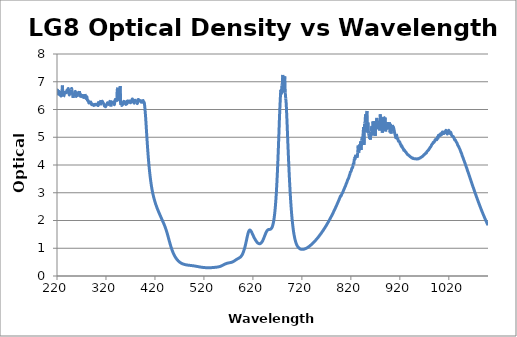
| Category | Optical Density |
|---|---|
| 200.0 | 6.448 |
| 201.0 | 6.433 |
| 202.0 | 6.392 |
| 203.0 | 6.585 |
| 204.0 | 6.576 |
| 205.0 | 6.474 |
| 206.0 | 6.541 |
| 207.0 | 6.442 |
| 208.0 | 6.505 |
| 209.0 | 6.621 |
| 210.0 | 6.461 |
| 211.0 | 6.497 |
| 212.0 | 6.621 |
| 213.0 | 6.536 |
| 214.0 | 6.559 |
| 215.0 | 6.58 |
| 216.0 | 6.502 |
| 217.0 | 6.586 |
| 218.0 | 6.65 |
| 219.0 | 6.626 |
| 220.0 | 6.564 |
| 221.0 | 6.699 |
| 222.0 | 6.606 |
| 223.0 | 6.649 |
| 224.0 | 6.643 |
| 225.0 | 6.542 |
| 226.0 | 6.558 |
| 227.0 | 6.606 |
| 228.0 | 6.485 |
| 229.0 | 6.53 |
| 230.0 | 6.617 |
| 231.0 | 6.868 |
| 232.0 | 6.562 |
| 233.0 | 6.467 |
| 234.0 | 6.485 |
| 235.0 | 6.551 |
| 236.0 | 6.616 |
| 237.0 | 6.601 |
| 238.0 | 6.604 |
| 239.0 | 6.611 |
| 240.0 | 6.692 |
| 241.0 | 6.636 |
| 242.0 | 6.696 |
| 243.0 | 6.754 |
| 244.0 | 6.627 |
| 245.0 | 6.525 |
| 246.0 | 6.608 |
| 247.0 | 6.684 |
| 248.0 | 6.541 |
| 249.0 | 6.725 |
| 250.0 | 6.757 |
| 251.0 | 6.644 |
| 252.0 | 6.534 |
| 253.0 | 6.419 |
| 254.0 | 6.586 |
| 255.0 | 6.552 |
| 256.0 | 6.562 |
| 257.0 | 6.648 |
| 258.0 | 6.624 |
| 259.0 | 6.476 |
| 260.0 | 6.502 |
| 261.0 | 6.498 |
| 262.0 | 6.532 |
| 263.0 | 6.604 |
| 264.0 | 6.578 |
| 265.0 | 6.576 |
| 266.0 | 6.664 |
| 267.0 | 6.457 |
| 268.0 | 6.573 |
| 269.0 | 6.431 |
| 270.0 | 6.552 |
| 271.0 | 6.435 |
| 272.0 | 6.475 |
| 273.0 | 6.445 |
| 274.0 | 6.461 |
| 275.0 | 6.539 |
| 276.0 | 6.392 |
| 277.0 | 6.557 |
| 278.0 | 6.477 |
| 279.0 | 6.398 |
| 280.0 | 6.446 |
| 281.0 | 6.455 |
| 282.0 | 6.335 |
| 283.0 | 6.332 |
| 284.0 | 6.312 |
| 285.0 | 6.237 |
| 286.0 | 6.249 |
| 287.0 | 6.245 |
| 288.0 | 6.238 |
| 289.0 | 6.269 |
| 290.0 | 6.197 |
| 291.0 | 6.173 |
| 292.0 | 6.202 |
| 293.0 | 6.173 |
| 294.0 | 6.169 |
| 295.0 | 6.143 |
| 296.0 | 6.169 |
| 297.0 | 6.185 |
| 298.0 | 6.163 |
| 299.0 | 6.189 |
| 300.0 | 6.171 |
| 301.0 | 6.185 |
| 302.0 | 6.19 |
| 303.0 | 6.187 |
| 304.0 | 6.144 |
| 305.0 | 6.288 |
| 306.0 | 6.205 |
| 307.0 | 6.254 |
| 308.0 | 6.259 |
| 309.0 | 6.152 |
| 310.0 | 6.342 |
| 311.0 | 6.231 |
| 312.0 | 6.291 |
| 313.0 | 6.285 |
| 314.0 | 6.248 |
| 315.0 | 6.216 |
| 316.0 | 6.175 |
| 317.0 | 6.122 |
| 318.0 | 6.15 |
| 319.0 | 6.097 |
| 320.0 | 6.132 |
| 321.0 | 6.175 |
| 322.0 | 6.194 |
| 323.0 | 6.246 |
| 324.0 | 6.202 |
| 325.0 | 6.184 |
| 326.0 | 6.227 |
| 327.0 | 6.222 |
| 328.0 | 6.296 |
| 329.0 | 6.328 |
| 330.0 | 6.109 |
| 331.0 | 6.31 |
| 332.0 | 6.209 |
| 333.0 | 6.231 |
| 334.0 | 6.226 |
| 335.0 | 6.201 |
| 336.0 | 6.272 |
| 337.0 | 6.171 |
| 338.0 | 6.266 |
| 339.0 | 6.361 |
| 340.0 | 6.324 |
| 341.0 | 6.34 |
| 342.0 | 6.283 |
| 343.0 | 6.737 |
| 344.0 | 6.786 |
| 345.0 | 6.695 |
| 346.0 | 6.448 |
| 347.0 | 6.461 |
| 348.0 | 6.31 |
| 349.0 | 6.848 |
| 350.0 | 6.16 |
| 351.0 | 6.151 |
| 352.0 | 6.147 |
| 353.0 | 6.156 |
| 354.0 | 6.183 |
| 355.0 | 6.212 |
| 356.0 | 6.286 |
| 357.0 | 6.284 |
| 358.0 | 6.224 |
| 359.0 | 6.221 |
| 360.0 | 6.204 |
| 361.0 | 6.187 |
| 362.0 | 6.293 |
| 363.0 | 6.203 |
| 364.0 | 6.292 |
| 365.0 | 6.309 |
| 366.0 | 6.274 |
| 367.0 | 6.26 |
| 368.0 | 6.299 |
| 369.0 | 6.304 |
| 370.0 | 6.241 |
| 371.0 | 6.269 |
| 372.0 | 6.307 |
| 373.0 | 6.338 |
| 374.0 | 6.378 |
| 375.0 | 6.289 |
| 376.0 | 6.319 |
| 377.0 | 6.237 |
| 378.0 | 6.245 |
| 379.0 | 6.381 |
| 380.0 | 6.271 |
| 381.0 | 6.296 |
| 382.0 | 6.287 |
| 383.0 | 6.244 |
| 384.0 | 6.213 |
| 385.0 | 6.264 |
| 386.0 | 6.363 |
| 387.0 | 6.306 |
| 388.0 | 6.331 |
| 389.0 | 6.325 |
| 390.0 | 6.312 |
| 391.0 | 6.313 |
| 392.0 | 6.258 |
| 393.0 | 6.304 |
| 394.0 | 6.282 |
| 395.0 | 6.265 |
| 396.0 | 6.324 |
| 397.0 | 6.244 |
| 398.0 | 6.254 |
| 399.0 | 6.139 |
| 400.0 | 5.935 |
| 401.0 | 5.711 |
| 402.0 | 5.43 |
| 403.0 | 5.143 |
| 404.0 | 4.866 |
| 405.0 | 4.606 |
| 406.0 | 4.363 |
| 407.0 | 4.147 |
| 408.0 | 3.95 |
| 409.0 | 3.773 |
| 410.0 | 3.612 |
| 411.0 | 3.468 |
| 412.0 | 3.339 |
| 413.0 | 3.223 |
| 414.0 | 3.121 |
| 415.0 | 3.028 |
| 416.0 | 2.945 |
| 417.0 | 2.87 |
| 418.0 | 2.8 |
| 419.0 | 2.736 |
| 420.0 | 2.677 |
| 421.0 | 2.619 |
| 422.0 | 2.566 |
| 423.0 | 2.515 |
| 424.0 | 2.466 |
| 425.0 | 2.42 |
| 426.0 | 2.376 |
| 427.0 | 2.333 |
| 428.0 | 2.292 |
| 429.0 | 2.25 |
| 430.0 | 2.21 |
| 431.0 | 2.168 |
| 432.0 | 2.128 |
| 433.0 | 2.088 |
| 434.0 | 2.048 |
| 435.0 | 2.008 |
| 436.0 | 1.969 |
| 437.0 | 1.929 |
| 438.0 | 1.889 |
| 439.0 | 1.846 |
| 440.0 | 1.802 |
| 441.0 | 1.756 |
| 442.0 | 1.705 |
| 443.0 | 1.652 |
| 444.0 | 1.596 |
| 445.0 | 1.536 |
| 446.0 | 1.474 |
| 447.0 | 1.411 |
| 448.0 | 1.345 |
| 449.0 | 1.281 |
| 450.0 | 1.217 |
| 451.0 | 1.154 |
| 452.0 | 1.094 |
| 453.0 | 1.037 |
| 454.0 | 0.983 |
| 455.0 | 0.933 |
| 456.0 | 0.885 |
| 457.0 | 0.842 |
| 458.0 | 0.802 |
| 459.0 | 0.765 |
| 460.0 | 0.731 |
| 461.0 | 0.699 |
| 462.0 | 0.67 |
| 463.0 | 0.643 |
| 464.0 | 0.618 |
| 465.0 | 0.595 |
| 466.0 | 0.574 |
| 467.0 | 0.555 |
| 468.0 | 0.537 |
| 469.0 | 0.521 |
| 470.0 | 0.505 |
| 471.0 | 0.492 |
| 472.0 | 0.48 |
| 473.0 | 0.469 |
| 474.0 | 0.458 |
| 475.0 | 0.45 |
| 476.0 | 0.442 |
| 477.0 | 0.435 |
| 478.0 | 0.428 |
| 479.0 | 0.422 |
| 480.0 | 0.417 |
| 481.0 | 0.412 |
| 482.0 | 0.408 |
| 483.0 | 0.405 |
| 484.0 | 0.401 |
| 485.0 | 0.398 |
| 486.0 | 0.396 |
| 487.0 | 0.393 |
| 488.0 | 0.39 |
| 489.0 | 0.388 |
| 490.0 | 0.386 |
| 491.0 | 0.384 |
| 492.0 | 0.382 |
| 493.0 | 0.38 |
| 494.0 | 0.378 |
| 495.0 | 0.375 |
| 496.0 | 0.373 |
| 497.0 | 0.371 |
| 498.0 | 0.368 |
| 499.0 | 0.366 |
| 500.0 | 0.363 |
| 501.0 | 0.36 |
| 502.0 | 0.357 |
| 503.0 | 0.354 |
| 504.0 | 0.351 |
| 505.0 | 0.348 |
| 506.0 | 0.345 |
| 507.0 | 0.341 |
| 508.0 | 0.338 |
| 509.0 | 0.335 |
| 510.0 | 0.331 |
| 511.0 | 0.328 |
| 512.0 | 0.325 |
| 513.0 | 0.322 |
| 514.0 | 0.319 |
| 515.0 | 0.317 |
| 516.0 | 0.314 |
| 517.0 | 0.312 |
| 518.0 | 0.31 |
| 519.0 | 0.308 |
| 520.0 | 0.306 |
| 521.0 | 0.304 |
| 522.0 | 0.303 |
| 523.0 | 0.302 |
| 524.0 | 0.3 |
| 525.0 | 0.3 |
| 526.0 | 0.299 |
| 527.0 | 0.298 |
| 528.0 | 0.298 |
| 529.0 | 0.298 |
| 530.0 | 0.298 |
| 531.0 | 0.298 |
| 532.0 | 0.298 |
| 533.0 | 0.299 |
| 534.0 | 0.3 |
| 535.0 | 0.301 |
| 536.0 | 0.302 |
| 537.0 | 0.303 |
| 538.0 | 0.305 |
| 539.0 | 0.306 |
| 540.0 | 0.308 |
| 541.0 | 0.31 |
| 542.0 | 0.311 |
| 543.0 | 0.313 |
| 544.0 | 0.315 |
| 545.0 | 0.317 |
| 546.0 | 0.319 |
| 547.0 | 0.322 |
| 548.0 | 0.324 |
| 549.0 | 0.327 |
| 550.0 | 0.331 |
| 551.0 | 0.335 |
| 552.0 | 0.34 |
| 553.0 | 0.346 |
| 554.0 | 0.352 |
| 555.0 | 0.359 |
| 556.0 | 0.367 |
| 557.0 | 0.375 |
| 558.0 | 0.383 |
| 559.0 | 0.393 |
| 560.0 | 0.402 |
| 561.0 | 0.411 |
| 562.0 | 0.42 |
| 563.0 | 0.429 |
| 564.0 | 0.437 |
| 565.0 | 0.444 |
| 566.0 | 0.451 |
| 567.0 | 0.456 |
| 568.0 | 0.462 |
| 569.0 | 0.466 |
| 570.0 | 0.47 |
| 571.0 | 0.473 |
| 572.0 | 0.477 |
| 573.0 | 0.48 |
| 574.0 | 0.483 |
| 575.0 | 0.487 |
| 576.0 | 0.491 |
| 577.0 | 0.497 |
| 578.0 | 0.504 |
| 579.0 | 0.512 |
| 580.0 | 0.521 |
| 581.0 | 0.532 |
| 582.0 | 0.543 |
| 583.0 | 0.555 |
| 584.0 | 0.567 |
| 585.0 | 0.579 |
| 586.0 | 0.59 |
| 587.0 | 0.601 |
| 588.0 | 0.611 |
| 589.0 | 0.621 |
| 590.0 | 0.63 |
| 591.0 | 0.64 |
| 592.0 | 0.651 |
| 593.0 | 0.663 |
| 594.0 | 0.676 |
| 595.0 | 0.693 |
| 596.0 | 0.712 |
| 597.0 | 0.736 |
| 598.0 | 0.765 |
| 599.0 | 0.799 |
| 600.0 | 0.839 |
| 601.0 | 0.886 |
| 602.0 | 0.939 |
| 603.0 | 0.998 |
| 604.0 | 1.064 |
| 605.0 | 1.137 |
| 606.0 | 1.215 |
| 607.0 | 1.298 |
| 608.0 | 1.38 |
| 609.0 | 1.459 |
| 610.0 | 1.53 |
| 611.0 | 1.587 |
| 612.0 | 1.628 |
| 613.0 | 1.651 |
| 614.0 | 1.656 |
| 615.0 | 1.645 |
| 616.0 | 1.622 |
| 617.0 | 1.592 |
| 618.0 | 1.555 |
| 619.0 | 1.517 |
| 620.0 | 1.479 |
| 621.0 | 1.44 |
| 622.0 | 1.403 |
| 623.0 | 1.368 |
| 624.0 | 1.335 |
| 625.0 | 1.305 |
| 626.0 | 1.277 |
| 627.0 | 1.251 |
| 628.0 | 1.228 |
| 629.0 | 1.208 |
| 630.0 | 1.191 |
| 631.0 | 1.177 |
| 632.0 | 1.168 |
| 633.0 | 1.163 |
| 634.0 | 1.162 |
| 635.0 | 1.167 |
| 636.0 | 1.177 |
| 637.0 | 1.193 |
| 638.0 | 1.214 |
| 639.0 | 1.242 |
| 640.0 | 1.274 |
| 641.0 | 1.312 |
| 642.0 | 1.354 |
| 643.0 | 1.398 |
| 644.0 | 1.444 |
| 645.0 | 1.49 |
| 646.0 | 1.533 |
| 647.0 | 1.572 |
| 648.0 | 1.606 |
| 649.0 | 1.633 |
| 650.0 | 1.653 |
| 651.0 | 1.666 |
| 652.0 | 1.674 |
| 653.0 | 1.678 |
| 654.0 | 1.679 |
| 655.0 | 1.682 |
| 656.0 | 1.688 |
| 657.0 | 1.699 |
| 658.0 | 1.72 |
| 659.0 | 1.752 |
| 660.0 | 1.798 |
| 661.0 | 1.86 |
| 662.0 | 1.941 |
| 663.0 | 2.047 |
| 664.0 | 2.177 |
| 665.0 | 2.338 |
| 666.0 | 2.534 |
| 667.0 | 2.769 |
| 668.0 | 3.045 |
| 669.0 | 3.371 |
| 670.0 | 3.737 |
| 671.0 | 4.153 |
| 672.0 | 4.606 |
| 673.0 | 5.084 |
| 674.0 | 5.589 |
| 675.0 | 6.041 |
| 676.0 | 6.413 |
| 677.0 | 6.711 |
| 678.0 | 6.544 |
| 679.0 | 6.85 |
| 680.0 | 6.899 |
| 681.0 | 7.247 |
| 682.0 | 6.708 |
| 683.0 | 6.611 |
| 684.0 | 6.724 |
| 685.0 | 7.194 |
| 686.0 | 6.613 |
| 687.0 | 6.398 |
| 688.0 | 6.207 |
| 689.0 | 5.825 |
| 690.0 | 5.402 |
| 691.0 | 4.948 |
| 692.0 | 4.518 |
| 693.0 | 4.101 |
| 694.0 | 3.716 |
| 695.0 | 3.359 |
| 696.0 | 3.033 |
| 697.0 | 2.743 |
| 698.0 | 2.483 |
| 699.0 | 2.254 |
| 700.0 | 2.054 |
| 701.0 | 1.88 |
| 702.0 | 1.729 |
| 703.0 | 1.601 |
| 704.0 | 1.49 |
| 705.0 | 1.397 |
| 706.0 | 1.317 |
| 707.0 | 1.249 |
| 708.0 | 1.193 |
| 709.0 | 1.145 |
| 710.0 | 1.106 |
| 711.0 | 1.073 |
| 712.0 | 1.046 |
| 713.0 | 1.025 |
| 714.0 | 1.007 |
| 715.0 | 0.993 |
| 716.0 | 0.982 |
| 717.0 | 0.973 |
| 718.0 | 0.967 |
| 719.0 | 0.963 |
| 720.0 | 0.961 |
| 721.0 | 0.96 |
| 722.0 | 0.961 |
| 723.0 | 0.963 |
| 724.0 | 0.967 |
| 725.0 | 0.972 |
| 726.0 | 0.977 |
| 727.0 | 0.984 |
| 728.0 | 0.992 |
| 729.0 | 1 |
| 730.0 | 1.009 |
| 731.0 | 1.019 |
| 732.0 | 1.03 |
| 733.0 | 1.042 |
| 734.0 | 1.055 |
| 735.0 | 1.068 |
| 736.0 | 1.082 |
| 737.0 | 1.096 |
| 738.0 | 1.111 |
| 739.0 | 1.126 |
| 740.0 | 1.142 |
| 741.0 | 1.159 |
| 742.0 | 1.176 |
| 743.0 | 1.193 |
| 744.0 | 1.211 |
| 745.0 | 1.229 |
| 746.0 | 1.248 |
| 747.0 | 1.267 |
| 748.0 | 1.287 |
| 749.0 | 1.306 |
| 750.0 | 1.327 |
| 751.0 | 1.347 |
| 752.0 | 1.369 |
| 753.0 | 1.391 |
| 754.0 | 1.413 |
| 755.0 | 1.436 |
| 756.0 | 1.459 |
| 757.0 | 1.483 |
| 758.0 | 1.506 |
| 759.0 | 1.53 |
| 760.0 | 1.555 |
| 761.0 | 1.581 |
| 762.0 | 1.606 |
| 763.0 | 1.632 |
| 764.0 | 1.659 |
| 765.0 | 1.686 |
| 766.0 | 1.713 |
| 767.0 | 1.741 |
| 768.0 | 1.769 |
| 769.0 | 1.798 |
| 770.0 | 1.827 |
| 771.0 | 1.857 |
| 772.0 | 1.887 |
| 773.0 | 1.918 |
| 774.0 | 1.949 |
| 775.0 | 1.98 |
| 776.0 | 2.012 |
| 777.0 | 2.046 |
| 778.0 | 2.077 |
| 779.0 | 2.111 |
| 780.0 | 2.145 |
| 781.0 | 2.179 |
| 782.0 | 2.215 |
| 783.0 | 2.25 |
| 784.0 | 2.285 |
| 785.0 | 2.323 |
| 786.0 | 2.359 |
| 787.0 | 2.396 |
| 788.0 | 2.434 |
| 789.0 | 2.473 |
| 790.0 | 2.511 |
| 791.0 | 2.551 |
| 792.0 | 2.592 |
| 793.0 | 2.632 |
| 794.0 | 2.673 |
| 795.0 | 2.714 |
| 796.0 | 2.756 |
| 797.0 | 2.799 |
| 798.0 | 2.843 |
| 799.0 | 2.888 |
| 800.0 | 2.885 |
| 801.0 | 2.93 |
| 802.0 | 2.969 |
| 803.0 | 2.995 |
| 804.0 | 3.039 |
| 805.0 | 3.085 |
| 806.0 | 3.123 |
| 807.0 | 3.168 |
| 808.0 | 3.213 |
| 809.0 | 3.248 |
| 810.0 | 3.302 |
| 811.0 | 3.342 |
| 812.0 | 3.384 |
| 813.0 | 3.435 |
| 814.0 | 3.485 |
| 815.0 | 3.507 |
| 816.0 | 3.559 |
| 817.0 | 3.621 |
| 818.0 | 3.669 |
| 819.0 | 3.745 |
| 820.0 | 3.761 |
| 821.0 | 3.803 |
| 822.0 | 3.884 |
| 823.0 | 3.889 |
| 824.0 | 3.94 |
| 825.0 | 4.04 |
| 826.0 | 4.012 |
| 827.0 | 4.218 |
| 828.0 | 4.272 |
| 829.0 | 4.231 |
| 830.0 | 4.369 |
| 831.0 | 4.268 |
| 832.0 | 4.317 |
| 833.0 | 4.265 |
| 834.0 | 4.447 |
| 835.0 | 4.704 |
| 836.0 | 4.449 |
| 837.0 | 4.497 |
| 838.0 | 4.743 |
| 839.0 | 4.68 |
| 840.0 | 4.852 |
| 841.0 | 4.543 |
| 842.0 | 4.869 |
| 843.0 | 5.006 |
| 844.0 | 4.932 |
| 845.0 | 5.126 |
| 846.0 | 5.369 |
| 847.0 | 4.721 |
| 848.0 | 5.485 |
| 849.0 | 5.53 |
| 850.0 | 5.826 |
| 851.0 | 5.53 |
| 852.0 | 5.741 |
| 853.0 | 5.948 |
| 854.0 | 5.172 |
| 855.0 | 5.53 |
| 856.0 | 5.124 |
| 857.0 | 5.08 |
| 858.0 | 4.978 |
| 859.0 | 4.991 |
| 860.0 | 4.912 |
| 861.0 | 5.205 |
| 862.0 | 5.314 |
| 863.0 | 5.405 |
| 864.0 | 5.066 |
| 865.0 | 5.576 |
| 866.0 | 5.514 |
| 867.0 | 5.154 |
| 868.0 | 5.431 |
| 869.0 | 5.573 |
| 870.0 | 5.042 |
| 871.0 | 5.53 |
| 872.0 | 5.573 |
| 873.0 | 5.697 |
| 874.0 | 5.53 |
| 875.0 | 5.342 |
| 876.0 | 5.337 |
| 877.0 | 5.593 |
| 878.0 | 5.44 |
| 879.0 | 5.239 |
| 880.0 | 5.826 |
| 881.0 | 5.514 |
| 882.0 | 5.53 |
| 883.0 | 5.668 |
| 884.0 | 5.163 |
| 885.0 | 5.263 |
| 886.0 | 5.53 |
| 887.0 | 5.738 |
| 888.0 | 5.711 |
| 889.0 | 5.541 |
| 890.0 | 5.709 |
| 891.0 | 5.208 |
| 892.0 | 5.332 |
| 893.0 | 5.279 |
| 894.0 | 5.493 |
| 895.0 | 5.547 |
| 896.0 | 5.289 |
| 897.0 | 5.514 |
| 898.0 | 5.394 |
| 899.0 | 5.54 |
| 900.0 | 5.174 |
| 901.0 | 5.482 |
| 902.0 | 5.13 |
| 903.0 | 5.205 |
| 904.0 | 5.43 |
| 905.0 | 5.44 |
| 906.0 | 5.367 |
| 907.0 | 5.362 |
| 908.0 | 5.282 |
| 909.0 | 5.191 |
| 910.0 | 5.112 |
| 911.0 | 5.042 |
| 912.0 | 4.982 |
| 913.0 | 5.12 |
| 914.0 | 5.015 |
| 915.0 | 4.944 |
| 916.0 | 4.943 |
| 917.0 | 4.863 |
| 918.0 | 4.856 |
| 919.0 | 4.841 |
| 920.0 | 4.815 |
| 921.0 | 4.748 |
| 922.0 | 4.741 |
| 923.0 | 4.673 |
| 924.0 | 4.692 |
| 925.0 | 4.646 |
| 926.0 | 4.606 |
| 927.0 | 4.589 |
| 928.0 | 4.531 |
| 929.0 | 4.544 |
| 930.0 | 4.516 |
| 931.0 | 4.49 |
| 932.0 | 4.465 |
| 933.0 | 4.451 |
| 934.0 | 4.418 |
| 935.0 | 4.394 |
| 936.0 | 4.374 |
| 937.0 | 4.368 |
| 938.0 | 4.349 |
| 939.0 | 4.336 |
| 940.0 | 4.32 |
| 941.0 | 4.301 |
| 942.0 | 4.29 |
| 943.0 | 4.274 |
| 944.0 | 4.268 |
| 945.0 | 4.253 |
| 946.0 | 4.255 |
| 947.0 | 4.232 |
| 948.0 | 4.231 |
| 949.0 | 4.229 |
| 950.0 | 4.228 |
| 951.0 | 4.228 |
| 952.0 | 4.221 |
| 953.0 | 4.222 |
| 954.0 | 4.214 |
| 955.0 | 4.218 |
| 956.0 | 4.227 |
| 957.0 | 4.219 |
| 958.0 | 4.224 |
| 959.0 | 4.235 |
| 960.0 | 4.242 |
| 961.0 | 4.254 |
| 962.0 | 4.256 |
| 963.0 | 4.274 |
| 964.0 | 4.284 |
| 965.0 | 4.297 |
| 966.0 | 4.313 |
| 967.0 | 4.317 |
| 968.0 | 4.342 |
| 969.0 | 4.361 |
| 970.0 | 4.379 |
| 971.0 | 4.385 |
| 972.0 | 4.408 |
| 973.0 | 4.432 |
| 974.0 | 4.432 |
| 975.0 | 4.471 |
| 976.0 | 4.498 |
| 977.0 | 4.516 |
| 978.0 | 4.528 |
| 979.0 | 4.552 |
| 980.0 | 4.586 |
| 981.0 | 4.606 |
| 982.0 | 4.638 |
| 983.0 | 4.656 |
| 984.0 | 4.687 |
| 985.0 | 4.726 |
| 986.0 | 4.751 |
| 987.0 | 4.771 |
| 988.0 | 4.812 |
| 989.0 | 4.826 |
| 990.0 | 4.82 |
| 991.0 | 4.859 |
| 992.0 | 4.906 |
| 993.0 | 4.924 |
| 994.0 | 4.93 |
| 995.0 | 4.906 |
| 996.0 | 4.929 |
| 997.0 | 5.015 |
| 998.0 | 4.967 |
| 999.0 | 5.071 |
| 1000.0 | 5.054 |
| 1001.0 | 5.087 |
| 1002.0 | 5.058 |
| 1003.0 | 5.125 |
| 1004.0 | 5.085 |
| 1005.0 | 5.093 |
| 1006.0 | 5.147 |
| 1007.0 | 5.191 |
| 1008.0 | 5.175 |
| 1009.0 | 5.14 |
| 1010.0 | 5.135 |
| 1011.0 | 5.162 |
| 1012.0 | 5.204 |
| 1013.0 | 5.178 |
| 1014.0 | 5.253 |
| 1015.0 | 5.178 |
| 1016.0 | 5.152 |
| 1017.0 | 5.117 |
| 1018.0 | 5.19 |
| 1019.0 | 5.23 |
| 1020.0 | 5.247 |
| 1021.0 | 5.197 |
| 1022.0 | 5.141 |
| 1023.0 | 5.143 |
| 1024.0 | 5.177 |
| 1025.0 | 5.116 |
| 1026.0 | 5.064 |
| 1027.0 | 5.04 |
| 1028.0 | 5.036 |
| 1029.0 | 5.025 |
| 1030.0 | 4.989 |
| 1031.0 | 4.959 |
| 1032.0 | 4.905 |
| 1033.0 | 4.908 |
| 1034.0 | 4.87 |
| 1035.0 | 4.84 |
| 1036.0 | 4.808 |
| 1037.0 | 4.781 |
| 1038.0 | 4.723 |
| 1039.0 | 4.695 |
| 1040.0 | 4.666 |
| 1041.0 | 4.625 |
| 1042.0 | 4.588 |
| 1043.0 | 4.549 |
| 1044.0 | 4.497 |
| 1045.0 | 4.45 |
| 1046.0 | 4.414 |
| 1047.0 | 4.354 |
| 1048.0 | 4.305 |
| 1049.0 | 4.263 |
| 1050.0 | 4.214 |
| 1051.0 | 4.162 |
| 1052.0 | 4.115 |
| 1053.0 | 4.066 |
| 1054.0 | 4.012 |
| 1055.0 | 3.961 |
| 1056.0 | 3.914 |
| 1057.0 | 3.864 |
| 1058.0 | 3.809 |
| 1059.0 | 3.757 |
| 1060.0 | 3.705 |
| 1061.0 | 3.652 |
| 1062.0 | 3.6 |
| 1063.0 | 3.547 |
| 1064.0 | 3.496 |
| 1065.0 | 3.444 |
| 1066.0 | 3.39 |
| 1067.0 | 3.339 |
| 1068.0 | 3.285 |
| 1069.0 | 3.234 |
| 1070.0 | 3.184 |
| 1071.0 | 3.132 |
| 1072.0 | 3.08 |
| 1073.0 | 3.029 |
| 1074.0 | 2.978 |
| 1075.0 | 2.929 |
| 1076.0 | 2.881 |
| 1077.0 | 2.83 |
| 1078.0 | 2.782 |
| 1079.0 | 2.733 |
| 1080.0 | 2.683 |
| 1081.0 | 2.637 |
| 1082.0 | 2.59 |
| 1083.0 | 2.543 |
| 1084.0 | 2.497 |
| 1085.0 | 2.451 |
| 1086.0 | 2.406 |
| 1087.0 | 2.36 |
| 1088.0 | 2.317 |
| 1089.0 | 2.274 |
| 1090.0 | 2.23 |
| 1091.0 | 2.188 |
| 1092.0 | 2.146 |
| 1093.0 | 2.103 |
| 1094.0 | 2.063 |
| 1095.0 | 2.024 |
| 1096.0 | 1.984 |
| 1097.0 | 1.945 |
| 1098.0 | 1.906 |
| 1099.0 | 1.867 |
| 1100.0 | 1.83 |